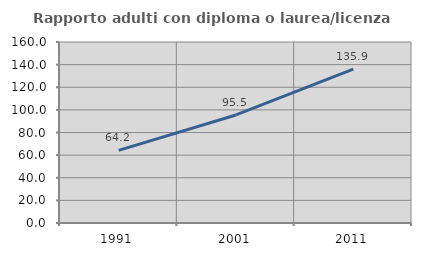
| Category | Rapporto adulti con diploma o laurea/licenza media  |
|---|---|
| 1991.0 | 64.183 |
| 2001.0 | 95.503 |
| 2011.0 | 135.945 |